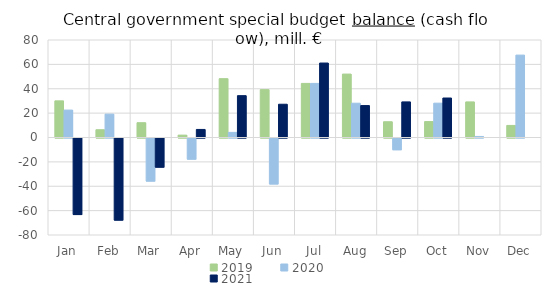
| Category | 2019 | 2020 | 2021 |
|---|---|---|---|
| Jan | 30062.851 | 22494.116 | -62808.075 |
| Feb | 6372.689 | 19172.585 | -67375.438 |
| Mar | 12140.425 | -35370.508 | -23930.666 |
| Apr | 1946.23 | -17362.308 | 6610.878 |
| May | 48256.783 | 4194.279 | 34323.187 |
| Jun | 39257.022 | -37730.164 | 27288.039 |
| Jul | 44379.878 | 44378.432 | 61101.998 |
| Aug | 52042.229 | 28132.233 | 26197.43 |
| Sep | 12935.014 | -9630.079 | 29202.435 |
| Oct | 13054.496 | 28163.169 | 32397.037 |
| Nov | 29199.135 | 857.326 | 0 |
| Dec | 9903.929 | 67612.173 | 0 |